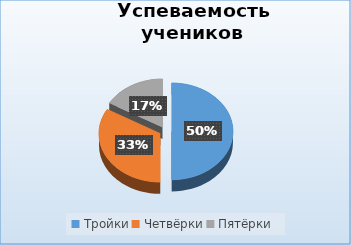
| Category | Series 0 |
|---|---|
| Тройки | 3 |
| Четвёрки | 2 |
| Пятёрки | 1 |